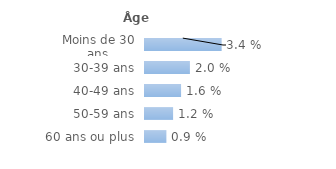
| Category | Series 0 |
|---|---|
| Moins de 30 ans | 0.034 |
| 30-39 ans | 0.02 |
| 40-49 ans | 0.016 |
| 50-59 ans | 0.012 |
| 60 ans ou plus | 0.009 |